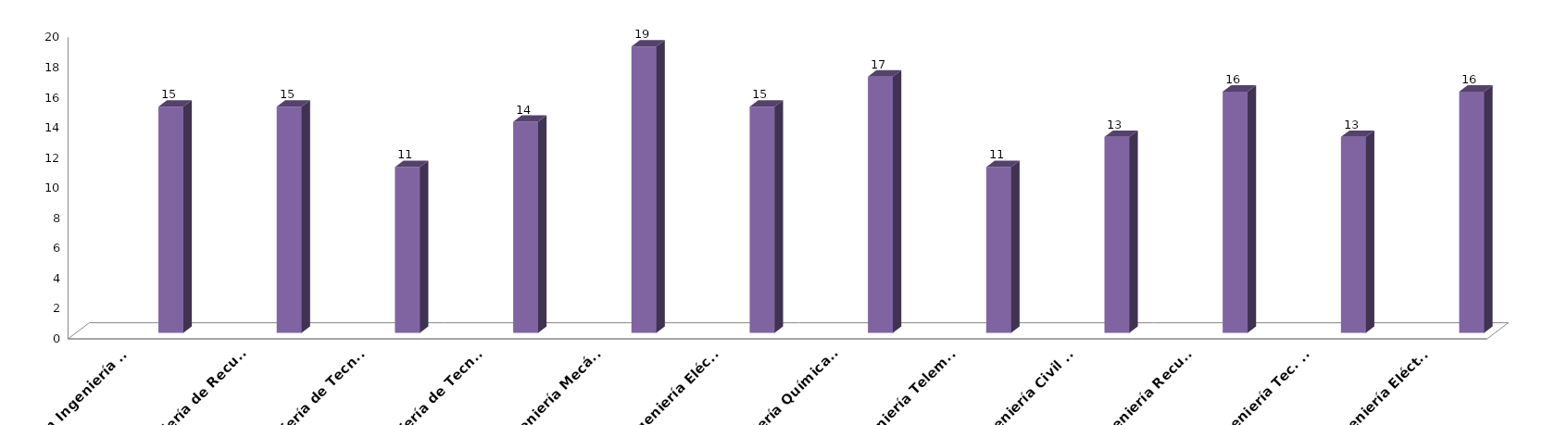
| Category | Series 0 | Series 1 | Series 2 | Series 3 |
|---|---|---|---|---|
| Grado en Ingeniería Civil |  |  |  | 15 |
| Grado en Ingeniería de Recursos Energéticos |  |  |  | 15 |
| Grado en Ingeniería de Tecnologías de Telecomunicación |  |  |  | 11 |
| Grado en Ingeniería de Tecnologías Mineras |  |  |  | 14 |
| Grado en Ingeniería Mecánica |  |  |  | 19 |
| Grado en Ingeniería Eléctrica |  |  |  | 15 |
| Grado en Ingeniería Química Industrial |  |  |  | 17 |
| Grado en Ingeniería Telemática |  |  |  | 11 |
| Doble Grado Ingeniería Civil y Tecnologías Mineras |  |  |  | 13 |
| Doble Grado Ingeniería Recursos Energéticos y Química Industrial |  |  |  | 16 |
| Doble Grado Ingeniería Tec. Telecomunicación e Ing. Telemática |  |  |  | 13 |
| Doble Grado Ingeniería Eléctrica e Ingeniería Mecánica |  |  |  | 16 |